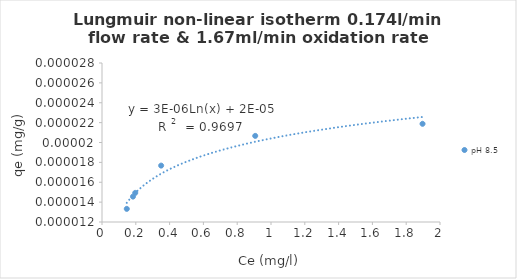
| Category | pH 8.5 |
|---|---|
| 1.8966666666666665 | 0 |
| 0.9066666666666667 | 0 |
| 0.3499999999999999 | 0 |
| 0.19666666666666668 | 0 |
| 0.18333333333333335 | 0 |
| 0.1466666666666667 | 0 |